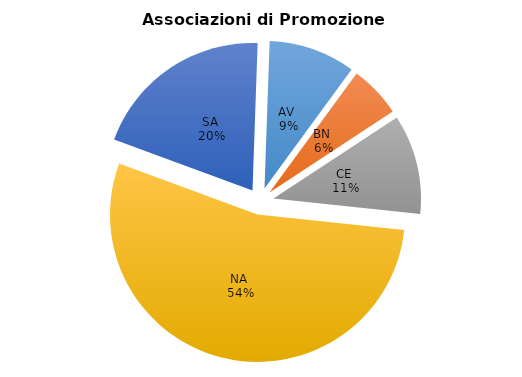
| Category | Series 0 |
|---|---|
| AV  | 60 |
| BN  | 36 |
| CE  | 69 |
| NA  | 341 |
| SA  | 126 |